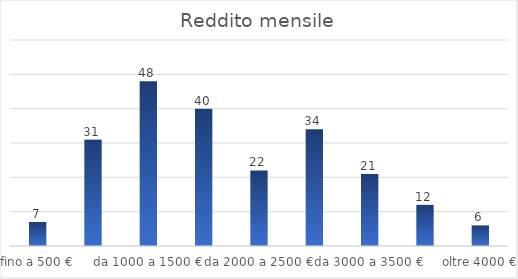
| Category | Reddito mensile |
|---|---|
| fino a 500 € | 7 |
| da 500 a 1000 € | 31 |
| da 1000 a 1500 € | 48 |
| da 1500 a 2000 € | 40 |
| da 2000 a 2500 € | 22 |
| da 2500 a 3000 € | 34 |
| da 3000 a 3500 € | 21 |
| da 3500 a 4000 € | 12 |
| oltre 4000 € | 6 |